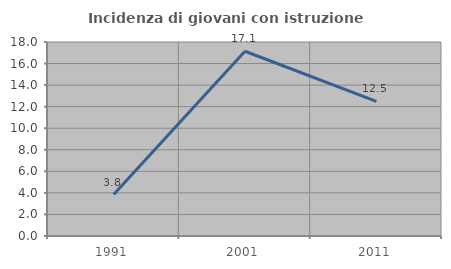
| Category | Incidenza di giovani con istruzione universitaria |
|---|---|
| 1991.0 | 3.846 |
| 2001.0 | 17.143 |
| 2011.0 | 12.5 |